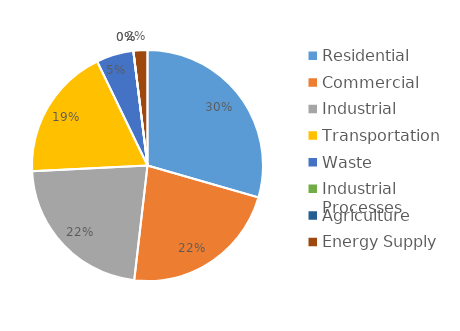
| Category | Series 0 |
|---|---|
| Residential | 915326 |
| Commercial | 695467 |
| Industrial | 695467 |
| Transportation | 578502 |
| Waste | 162100 |
| Industrial Processes | 0 |
| Agriculture | 0 |
| Energy Supply | 60871 |